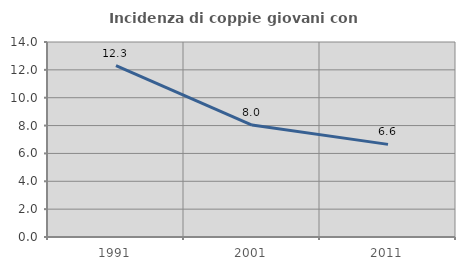
| Category | Incidenza di coppie giovani con figli |
|---|---|
| 1991.0 | 12.299 |
| 2001.0 | 8.036 |
| 2011.0 | 6.65 |